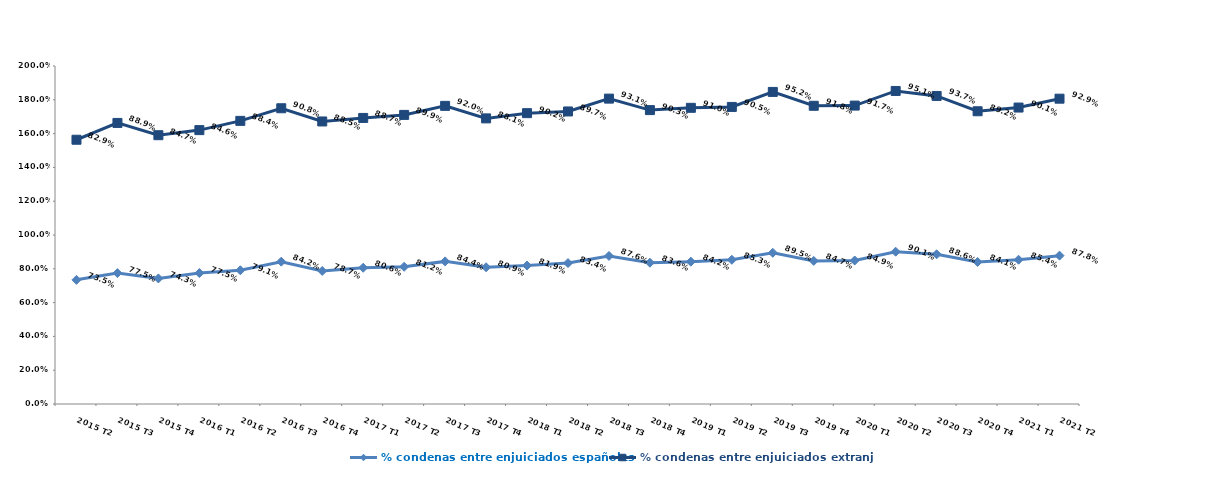
| Category | % condenas entre enjuiciados españoles | % condenas entre enjuiciados extranjeros |
|---|---|---|
| 2015 T2 | 0.735 | 0.829 |
| 2015 T3 | 0.775 | 0.889 |
| 2015 T4 | 0.743 | 0.847 |
| 2016 T1 | 0.775 | 0.846 |
| 2016 T2 | 0.791 | 0.884 |
| 2016 T3 | 0.842 | 0.908 |
| 2016 T4 | 0.787 | 0.885 |
| 2017 T1 | 0.806 | 0.887 |
| 2017 T2 | 0.812 | 0.899 |
| 2017 T3 | 0.844 | 0.92 |
| 2017 T4 | 0.809 | 0.881 |
| 2018 T1 | 0.819 | 0.902 |
| 2018 T2 | 0.834 | 0.897 |
| 2018 T3 | 0.876 | 0.931 |
| 2018 T4 | 0.836 | 0.903 |
| 2019 T1 | 0.842 | 0.91 |
| 2019 T2 | 0.853 | 0.905 |
| 2019 T3 | 0.895 | 0.952 |
| 2019 T4 | 0.847 | 0.918 |
| 2020 T1 | 0.849 | 0.917 |
| 2020 T2 | 0.901 | 0.951 |
| 2020 T3 | 0.886 | 0.937 |
| 2020 T4 | 0.841 | 0.892 |
| 2021 T1 | 0.854 | 0.901 |
| 2021 T2 | 0.878 | 0.929 |